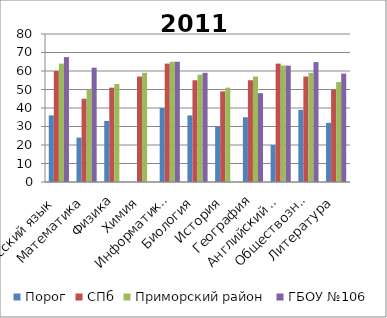
| Category | Порог | СПб | Приморский район | ГБОУ №106 |
|---|---|---|---|---|
| Русский язык | 36 | 60 | 64 | 67.5 |
| Математика | 24 | 45 | 50 | 61.8 |
| Физика | 33 | 51 | 53 | 0 |
| Химия | 0 | 57 | 59 | 0 |
| Информатика и ИКТ | 40 | 64 | 65 | 65 |
| Биология | 36 | 55 | 58 | 59 |
| История | 30 | 49 | 51 | 0 |
| География | 35 | 55 | 57 | 48 |
| Английский язык | 20 | 64 | 63 | 62.9 |
| Обществознание | 39 | 57 | 59 | 64.8 |
| Литература | 32 | 50 | 54 | 58.6 |